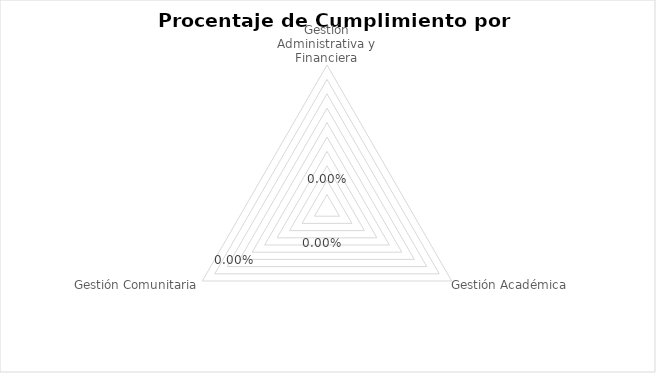
| Category | Series 0 |
|---|---|
| Gestión Administrativa y Financiera | 0 |
| Gestión Académica | 0 |
| Gestión Comunitaria | 0 |